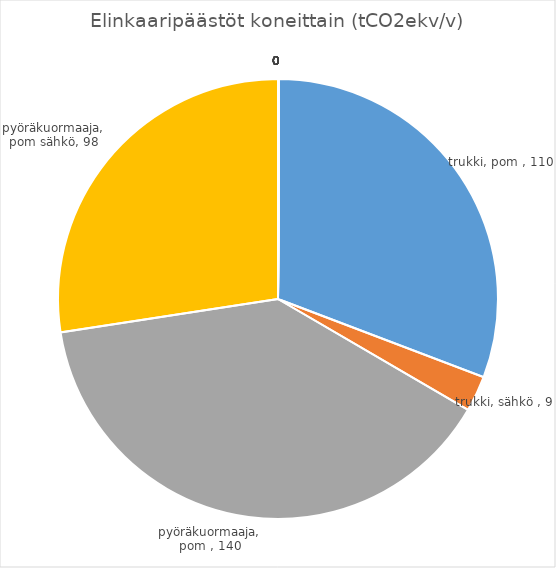
| Category | Elinkaaripäästöt koneittain |
|---|---|
| trukki, pom  | 110.183 |
| trukki, sähkö  | 9.358 |
| pyöräkuormaaja, pom  | 140.233 |
| pyöräkuormaaja, pom sähkö | 98.163 |